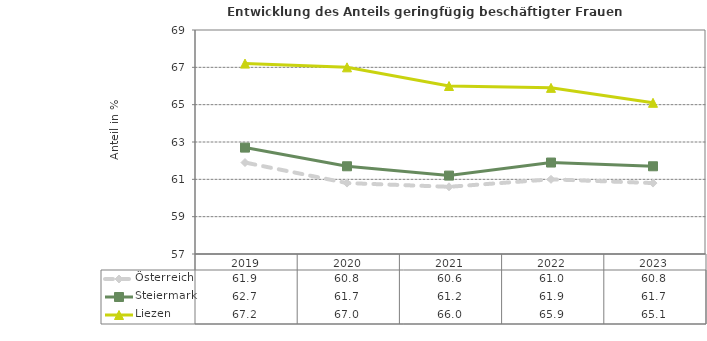
| Category | Österreich | Steiermark | Liezen |
|---|---|---|---|
| 2023.0 | 60.8 | 61.7 | 65.1 |
| 2022.0 | 61 | 61.9 | 65.9 |
| 2021.0 | 60.6 | 61.2 | 66 |
| 2020.0 | 60.8 | 61.7 | 67 |
| 2019.0 | 61.9 | 62.7 | 67.2 |